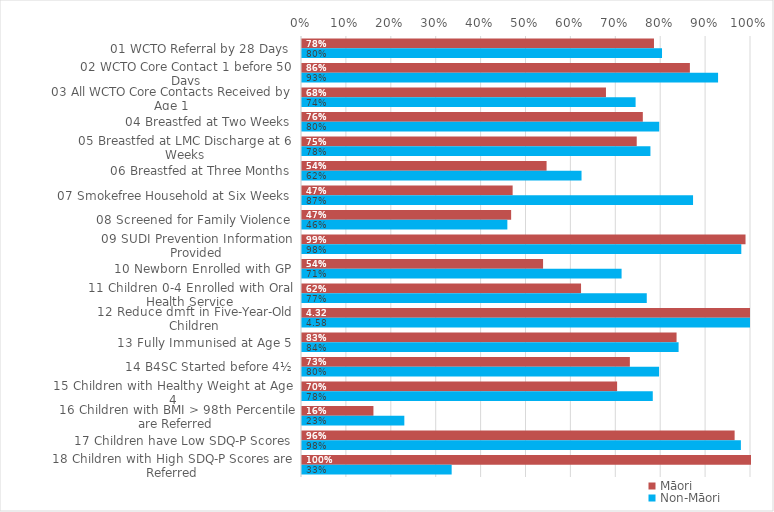
| Category | Māori | Non-Māori |
|---|---|---|
| 01 WCTO Referral by 28 Days | 0.784 | 0.802 |
| 02 WCTO Core Contact 1 before 50 Days | 0.864 | 0.927 |
| 03 All WCTO Core Contacts Received by Age 1 | 0.677 | 0.743 |
| 04 Breastfed at Two Weeks | 0.759 | 0.796 |
| 05 Breastfed at LMC Discharge at 6 Weeks | 0.746 | 0.776 |
| 06 Breastfed at Three Months | 0.545 | 0.623 |
| 07 Smokefree Household at Six Weeks | 0.469 | 0.871 |
| 08 Screened for Family Violence | 0.466 | 0.457 |
| 09 SUDI Prevention Information Provided | 0.988 | 0.978 |
| 10 Newborn Enrolled with GP | 0.537 | 0.712 |
| 11 Children 0-4 Enrolled with Oral Health Service | 0.621 | 0.768 |
| 12 Reduce dmft in Five-Year-Old Children | 4.319 | 4.579 |
| 13 Fully Immunised at Age 5 | 0.834 | 0.839 |
| 14 B4SC Started before 4½ | 0.73 | 0.795 |
| 15 Children with Healthy Weight at Age 4 | 0.702 | 0.781 |
| 16 Children with BMI > 98th Percentile are Referred | 0.159 | 0.228 |
| 17 Children have Low SDQ-P Scores | 0.964 | 0.977 |
| 18 Children with High SDQ-P Scores are Referred | 1 | 0.333 |